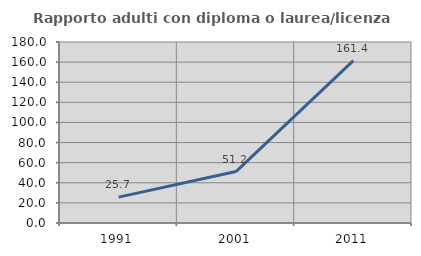
| Category | Rapporto adulti con diploma o laurea/licenza media  |
|---|---|
| 1991.0 | 25.714 |
| 2001.0 | 51.176 |
| 2011.0 | 161.411 |